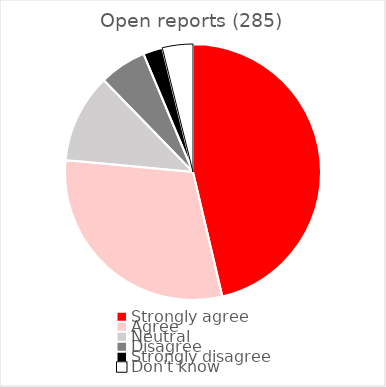
| Category | Open reports (285) |
|---|---|
| Strongly agree | 0.463 |
| Agree | 0.302 |
| Neutral | 0.112 |
| Disagree | 0.06 |
| Strongly disagree | 0.025 |
| Don't know | 0.039 |